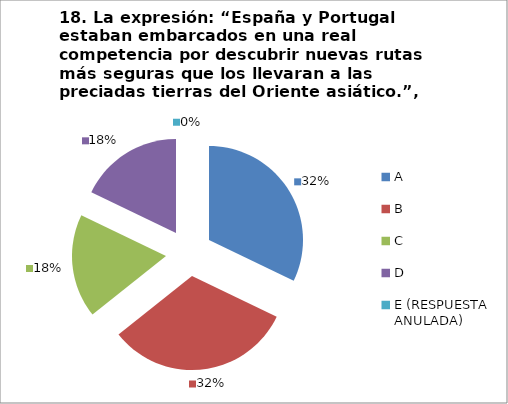
| Category | CANTIDAD DE RESPUESTAS PREGUNTA (18) | PORCENTAJE |
|---|---|---|
| A | 9 | 0.321 |
| B | 9 | 0.321 |
| C | 5 | 0.179 |
| D | 5 | 0.179 |
| E (RESPUESTA ANULADA) | 0 | 0 |